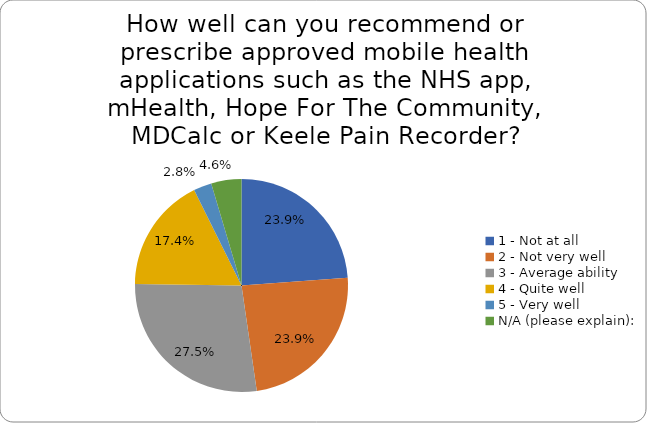
| Category | Series 0 |
|---|---|
| 1 - Not at all | 0.239 |
| 2 - Not very well | 0.239 |
| 3 - Average ability | 0.275 |
| 4 - Quite well | 0.174 |
| 5 - Very well | 0.028 |
| N/A (please explain): | 0.046 |